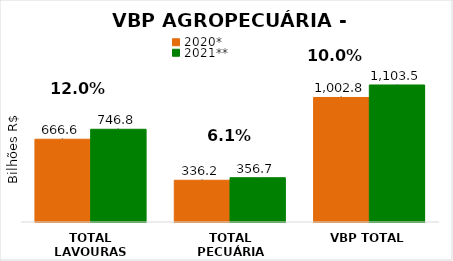
| Category | 2020* | 2021** |
|---|---|---|
| TOTAL LAVOURAS | 666.605 | 746.817 |
| TOTAL PECUÁRIA | 336.228 | 356.707 |
| VBP TOTAL | 1002.833 | 1103.525 |